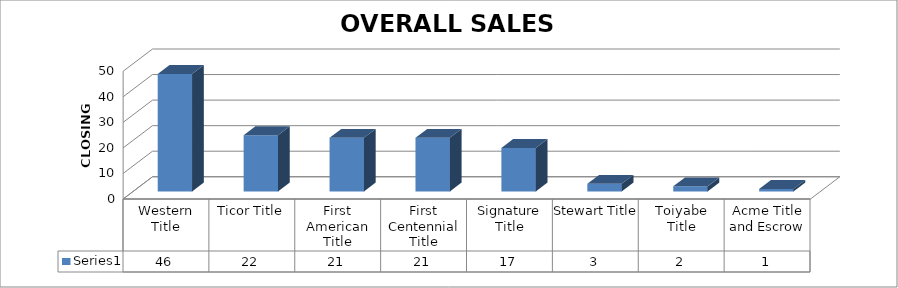
| Category | Series 0 |
|---|---|
| Western Title | 46 |
| Ticor Title | 22 |
| First American Title | 21 |
| First Centennial Title | 21 |
| Signature Title | 17 |
| Stewart Title | 3 |
| Toiyabe Title | 2 |
| Acme Title and Escrow | 1 |